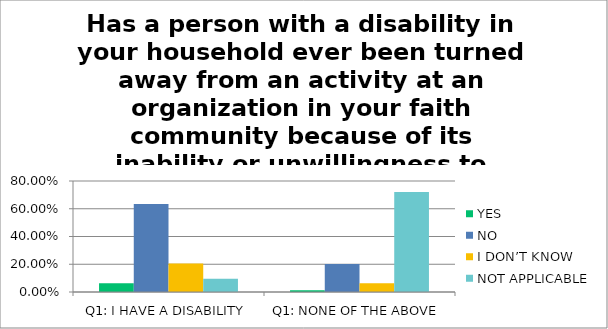
| Category | YES | NO | I DON’T KNOW | NOT APPLICABLE |
|---|---|---|---|---|
| Q1: I HAVE A DISABILITY | 0.064 | 0.635 | 0.206 | 0.095 |
| Q1: NONE OF THE ABOVE | 0.013 | 0.202 | 0.063 | 0.722 |